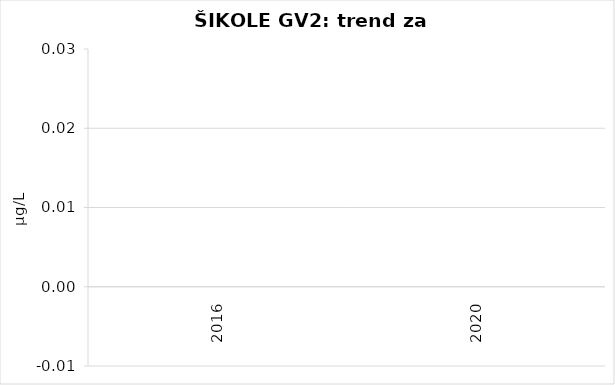
| Category | Vsota |
|---|---|
| 2016 | 0 |
| 2020 | 0 |